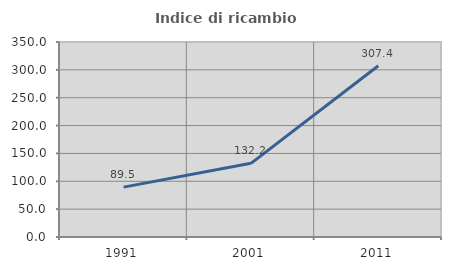
| Category | Indice di ricambio occupazionale  |
|---|---|
| 1991.0 | 89.474 |
| 2001.0 | 132.203 |
| 2011.0 | 307.407 |